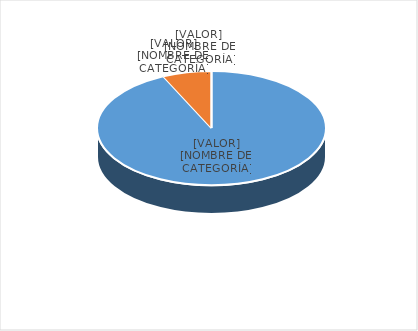
| Category | Series 0 |
|---|---|
| PRESUPUESTO VIGENTE PARA 2023 | 31000000 |
| PRESUPUESTO EJECUTADO  | 2303028 |
| PORCENTAJE DE EJECUCIÓN  | 0.074 |